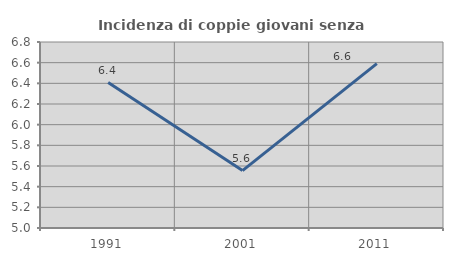
| Category | Incidenza di coppie giovani senza figli |
|---|---|
| 1991.0 | 6.407 |
| 2001.0 | 5.556 |
| 2011.0 | 6.591 |